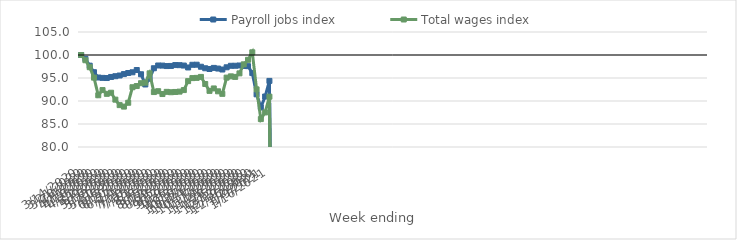
| Category | Payroll jobs index | Total wages index |
|---|---|---|
| 14/03/2020 | 100 | 100 |
| 21/03/2020 | 99.155 | 98.859 |
| 28/03/2020 | 97.68 | 97.347 |
| 04/04/2020 | 96.261 | 95.079 |
| 11/04/2020 | 95.105 | 91.25 |
| 18/04/2020 | 95.025 | 92.374 |
| 25/04/2020 | 94.996 | 91.558 |
| 02/05/2020 | 95.226 | 91.797 |
| 09/05/2020 | 95.39 | 90.292 |
| 16/05/2020 | 95.542 | 89.104 |
| 23/05/2020 | 95.852 | 88.783 |
| 30/05/2020 | 96.085 | 89.619 |
| 06/06/2020 | 96.241 | 92.995 |
| 13/06/2020 | 96.736 | 93.254 |
| 20/06/2020 | 95.812 | 93.867 |
| 27/06/2020 | 93.596 | 93.985 |
| 04/07/2020 | 94.862 | 96.018 |
| 11/07/2020 | 97.123 | 91.943 |
| 18/07/2020 | 97.718 | 92.132 |
| 25/07/2020 | 97.697 | 91.513 |
| 01/08/2020 | 97.598 | 91.99 |
| 08/08/2020 | 97.619 | 91.909 |
| 15/08/2020 | 97.811 | 91.966 |
| 22/08/2020 | 97.79 | 92.04 |
| 29/08/2020 | 97.704 | 92.374 |
| 05/09/2020 | 97.29 | 94.322 |
| 12/09/2020 | 97.872 | 94.979 |
| 19/09/2020 | 97.888 | 95.026 |
| 26/09/2020 | 97.448 | 95.235 |
| 03/10/2020 | 97.119 | 93.702 |
| 10/10/2020 | 96.954 | 92.202 |
| 17/10/2020 | 97.197 | 92.73 |
| 24/10/2020 | 97.053 | 92.103 |
| 31/10/2020 | 96.842 | 91.553 |
| 07/11/2020 | 97.33 | 95.085 |
| 14/11/2020 | 97.655 | 95.359 |
| 21/11/2020 | 97.662 | 95.24 |
| 28/11/2020 | 97.718 | 96.008 |
| 05/12/2020 | 97.613 | 97.972 |
| 12/12/2020 | 97.572 | 98.95 |
| 19/12/2020 | 96.066 | 100.586 |
| 26/12/2020 | 91.45 | 92.529 |
| 02/01/2021 | 88.614 | 86.068 |
| 09/01/2021 | 90.978 | 87.513 |
| 16/01/2021 | 94.372 | 90.939 |